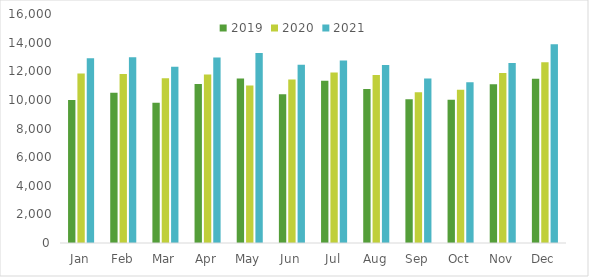
| Category | 2019 | 2020 | 2021 |
|---|---|---|---|
| Jan | 10000 | 11847 | 12913 |
| Feb | 10500 | 11802 | 12982 |
| Mar | 9800 | 11511 | 12317 |
| Apr | 11112 | 11779 | 12957 |
| May | 11493 | 11000 | 13275 |
| Jun | 10390 | 11429 | 12458 |
| Jul | 11342 | 11909 | 12743 |
| Aug | 10764 | 11733 | 12437 |
| Sep | 10039 | 10541 | 11490 |
| Oct | 10003 | 10703 | 11238 |
| Nov | 11095 | 11872 | 12584 |
| Dec | 11479 | 12627 | 13890 |